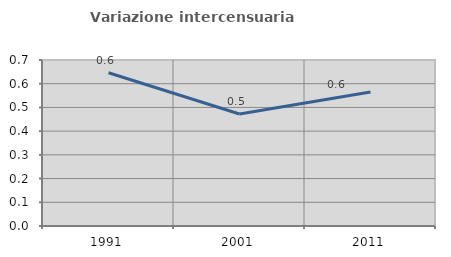
| Category | Variazione intercensuaria annua |
|---|---|
| 1991.0 | 0.646 |
| 2001.0 | 0.472 |
| 2011.0 | 0.565 |